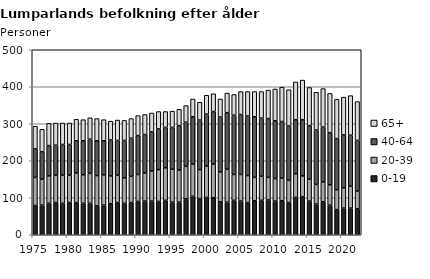
| Category | 0-19 | 20-39 | 40-64 | 65+ |
|---|---|---|---|---|
| 1975.0 | 79 | 76 | 77 | 61 |
| 1976.0 | 80 | 70 | 74 | 61 |
| 1977.0 | 85 | 74 | 82 | 60 |
| 1978.0 | 87 | 74 | 81 | 60 |
| 1979.0 | 85 | 76 | 83 | 58 |
| 1980.0 | 87 | 74 | 83 | 58 |
| 1981.0 | 87 | 80 | 87 | 58 |
| 1982.0 | 85 | 77 | 92 | 57 |
| 1983.0 | 85 | 81 | 92 | 58 |
| 1984.0 | 78 | 82 | 94 | 60 |
| 1985.0 | 80 | 82 | 92 | 57 |
| 1986.0 | 84 | 75 | 97 | 51 |
| 1987.0 | 87 | 74 | 94 | 55 |
| 1988.0 | 85 | 69 | 101 | 54 |
| 1989.0 | 87 | 71 | 103 | 53 |
| 1990.0 | 90 | 73 | 105 | 54 |
| 1991.0 | 91 | 76 | 104 | 54 |
| 1992.0 | 91 | 81 | 106 | 51 |
| 1993.0 | 90 | 86 | 110 | 47 |
| 1994.0 | 93 | 88 | 109 | 43 |
| 1995.0 | 88 | 89 | 113 | 44 |
| 1996.0 | 88 | 87 | 120 | 44 |
| 1997.0 | 97 | 88 | 119 | 45 |
| 1998.0 | 104 | 87 | 128 | 48 |
| 1999.0 | 98 | 78 | 134 | 48 |
| 2000.0 | 101 | 85 | 140 | 51 |
| 2001.0 | 100 | 91 | 142 | 48 |
| 2002.0 | 89 | 81 | 148 | 49 |
| 2003.0 | 88 | 89 | 153 | 53 |
| 2004.0 | 93 | 70 | 160 | 56 |
| 2005.0 | 91 | 72 | 162 | 62 |
| 2006.0 | 87 | 73 | 161 | 66 |
| 2007.0 | 92 | 63 | 164 | 68 |
| 2008.0 | 93 | 65 | 157 | 72 |
| 2009.0 | 94 | 61 | 159 | 77 |
| 2010.0 | 91 | 61 | 156 | 86 |
| 2011.0 | 92 | 61 | 153 | 93 |
| 2012.0 | 87 | 60 | 147 | 98 |
| 2013.0 | 101 | 64 | 146 | 102 |
| 2014.0 | 103 | 56 | 152 | 107 |
| 2015.0 | 91 | 59 | 145 | 103 |
| 2016.0 | 83 | 53 | 147 | 102 |
| 2017.0 | 89 | 54 | 148 | 104 |
| 2018.0 | 80 | 55 | 141 | 106 |
| 2019.0 | 68 | 54 | 138 | 106 |
| 2020.0 | 72 | 55 | 143 | 102 |
| 2021.0 | 72 | 59 | 138 | 107 |
| 2022.0 | 70 | 48 | 137 | 105 |